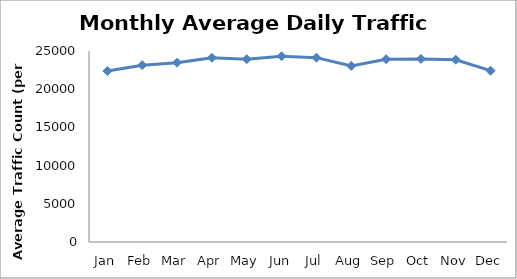
| Category | Series 0 |
|---|---|
| Jan | 22383 |
| Feb | 23147 |
| Mar | 23475.5 |
| Apr | 24115.5 |
| May | 23927.25 |
| Jun | 24311.5 |
| Jul | 24128.5 |
| Aug | 23044.25 |
| Sep | 23930 |
| Oct | 23967.75 |
| Nov | 23860.5 |
| Dec | 22422.75 |